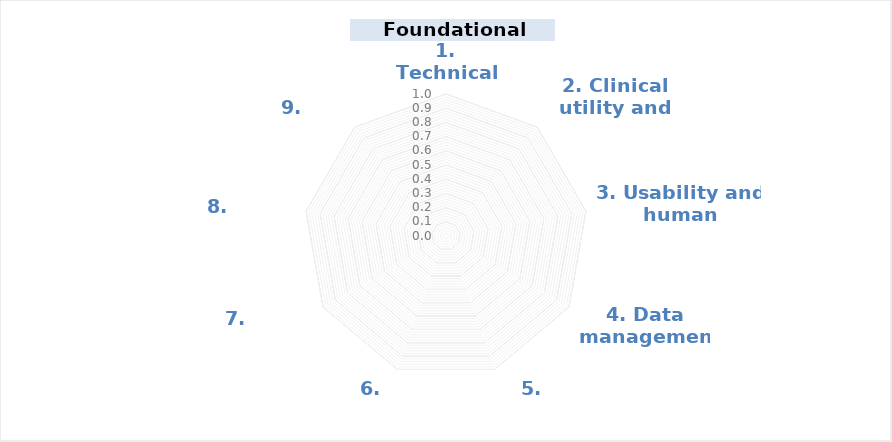
| Category | Series 0 |
|---|---|
| 1. Technical aspects | 0 |
| 2. Clinical utility and safety | 0 |
| 3. Usability and human centricity | 0 |
| 4. Data management | 0 |
| 5. Functionality | 0 |
| 6. Content | 0 |
| 7. Endorsement | 0 |
| 8. Maintenance  | 0 |
| 9. Developer | 0 |